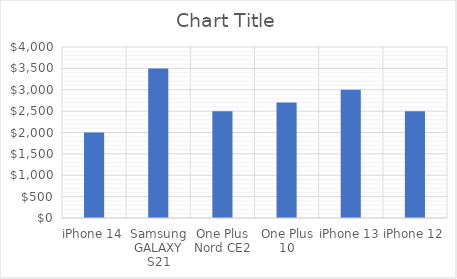
| Category | Series 0 |
|---|---|
| iPhone 14 | 2000 |
| Samsung GALAXY S21 | 3500 |
| One Plus Nord CE2 | 2500 |
| One Plus 10 | 2700 |
| iPhone 13 | 3000 |
| iPhone 12 | 2500 |